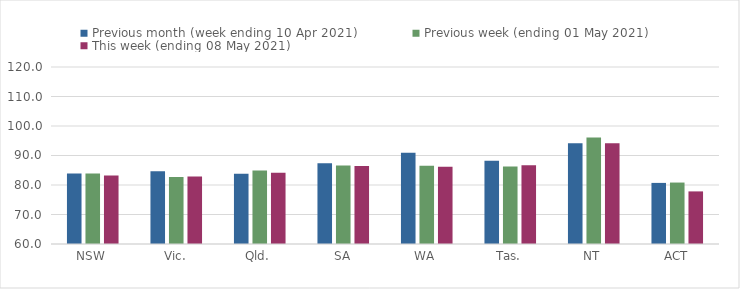
| Category | Previous month (week ending 10 Apr 2021) | Previous week (ending 01 May 2021) | This week (ending 08 May 2021) |
|---|---|---|---|
| NSW | 83.92 | 83.88 | 83.22 |
| Vic. | 84.64 | 82.68 | 82.84 |
| Qld. | 83.79 | 84.92 | 84.16 |
| SA | 87.38 | 86.57 | 86.46 |
| WA | 90.9 | 86.54 | 86.2 |
| Tas. | 88.2 | 86.29 | 86.66 |
| NT | 94.12 | 96.11 | 94.12 |
| ACT | 80.71 | 80.83 | 77.83 |